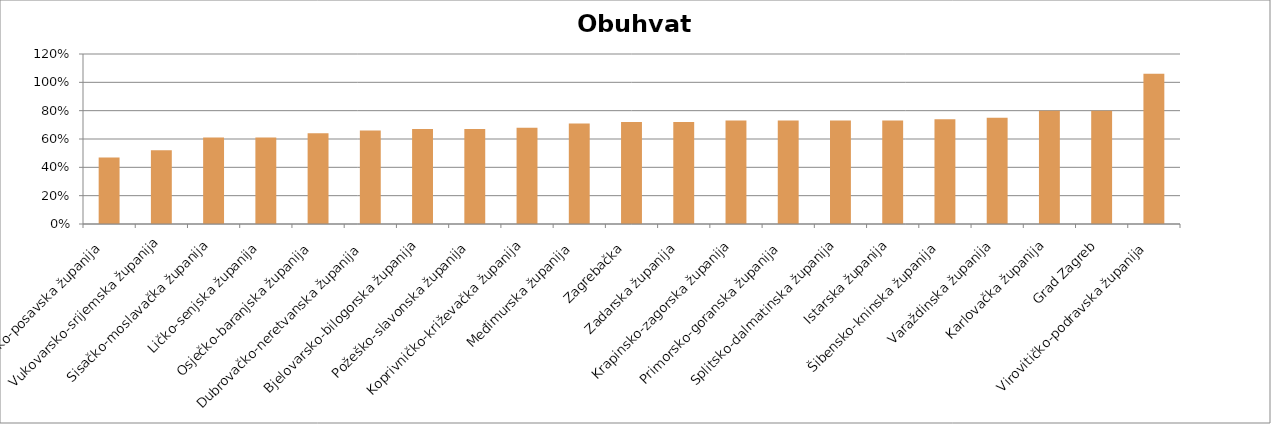
| Category | Obuhvat 5+ |
|---|---|
| Brodsko-posavska županija  | 0.47 |
| Vukovarsko-srijemska županija | 0.52 |
| Sisačko-moslavačka županija | 0.61 |
| Ličko-senjska županija  | 0.61 |
| Osječko-baranjska županija  | 0.64 |
| Dubrovačko-neretvanska županija  | 0.66 |
| Bjelovarsko-bilogorska županija  | 0.67 |
| Požeško-slavonska županija  | 0.67 |
| Koprivničko-križevačka županija  | 0.68 |
| Međimurska županija  | 0.71 |
| Zagrebačka  | 0.72 |
| Zadarska županija  | 0.72 |
| Krapinsko-zagorska županija | 0.73 |
| Primorsko-goranska županija  | 0.73 |
| Splitsko-dalmatinska županija  | 0.73 |
| Istarska županija  | 0.73 |
| Šibensko-kninska županija  | 0.74 |
| Varaždinska županija | 0.75 |
| Karlovačka županija | 0.8 |
| Grad Zagreb | 0.8 |
| Virovitičko-podravska županija  | 1.06 |